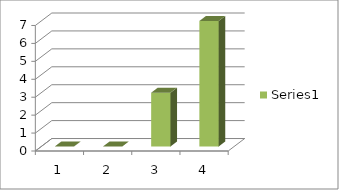
| Category | Series 0 |
|---|---|
| 0 | 0 |
| 1 | 0 |
| 2 | 3 |
| 3 | 7 |